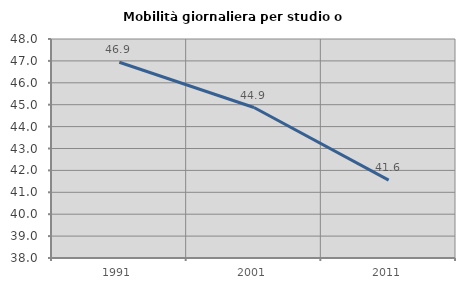
| Category | Mobilità giornaliera per studio o lavoro |
|---|---|
| 1991.0 | 46.939 |
| 2001.0 | 44.872 |
| 2011.0 | 41.558 |